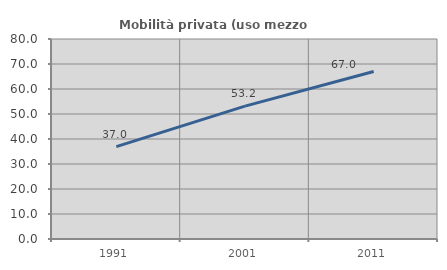
| Category | Mobilità privata (uso mezzo privato) |
|---|---|
| 1991.0 | 36.972 |
| 2001.0 | 53.165 |
| 2011.0 | 66.993 |